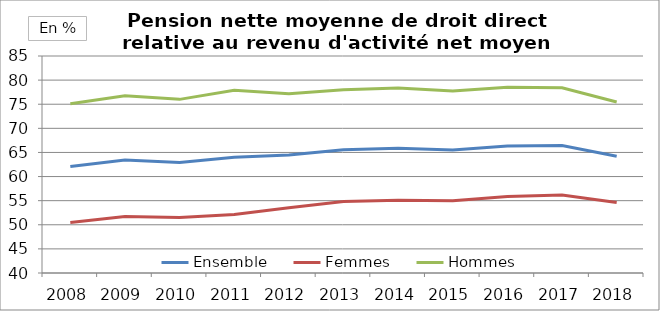
| Category | Ensemble | Femmes | Hommes |
|---|---|---|---|
| 2008.0 | 62.091 | 50.496 | 75.097 |
| 2009.0 | 63.451 | 51.728 | 76.777 |
| 2010.0 | 62.909 | 51.505 | 76.009 |
| 2011.0 | 64.004 | 52.132 | 77.902 |
| 2012.0 | 64.481 | 53.517 | 77.156 |
| 2013.0 | 65.554 | 54.829 | 78.016 |
| 2014.0 | 65.859 | 55.108 | 78.36 |
| 2015.0 | 65.494 | 54.96 | 77.746 |
| 2016.0 | 66.317 | 55.847 | 78.525 |
| 2017.0 | 66.416 | 56.174 | 78.408 |
| 2018.0 | 64.206 | 54.601 | 75.448 |